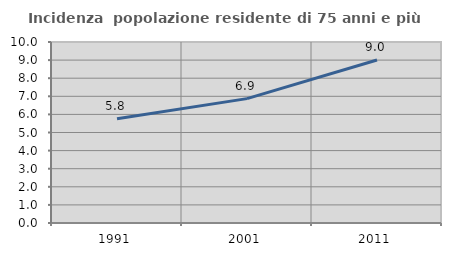
| Category | Incidenza  popolazione residente di 75 anni e più |
|---|---|
| 1991.0 | 5.756 |
| 2001.0 | 6.872 |
| 2011.0 | 9.003 |